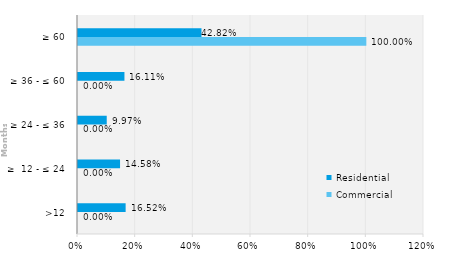
| Category | Commercial | Residential |
|---|---|---|
| >12 | 0 | 0.165 |
| ≥  12 - ≤ 24 | 0 | 0.146 |
| ≥ 24 - ≤ 36 | 0 | 0.1 |
| ≥ 36 - ≤ 60 | 0 | 0.161 |
| ≥ 60 | 1 | 0.428 |